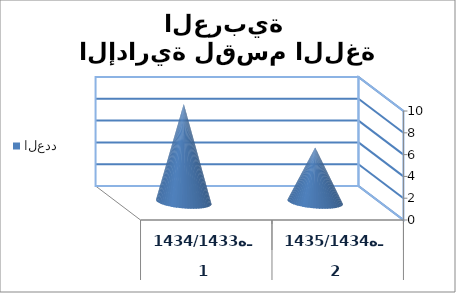
| Category | العدد |
|---|---|
| 0 | 9 |
| 1 | 5 |